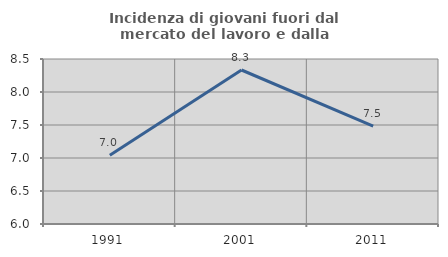
| Category | Incidenza di giovani fuori dal mercato del lavoro e dalla formazione  |
|---|---|
| 1991.0 | 7.04 |
| 2001.0 | 8.333 |
| 2011.0 | 7.482 |